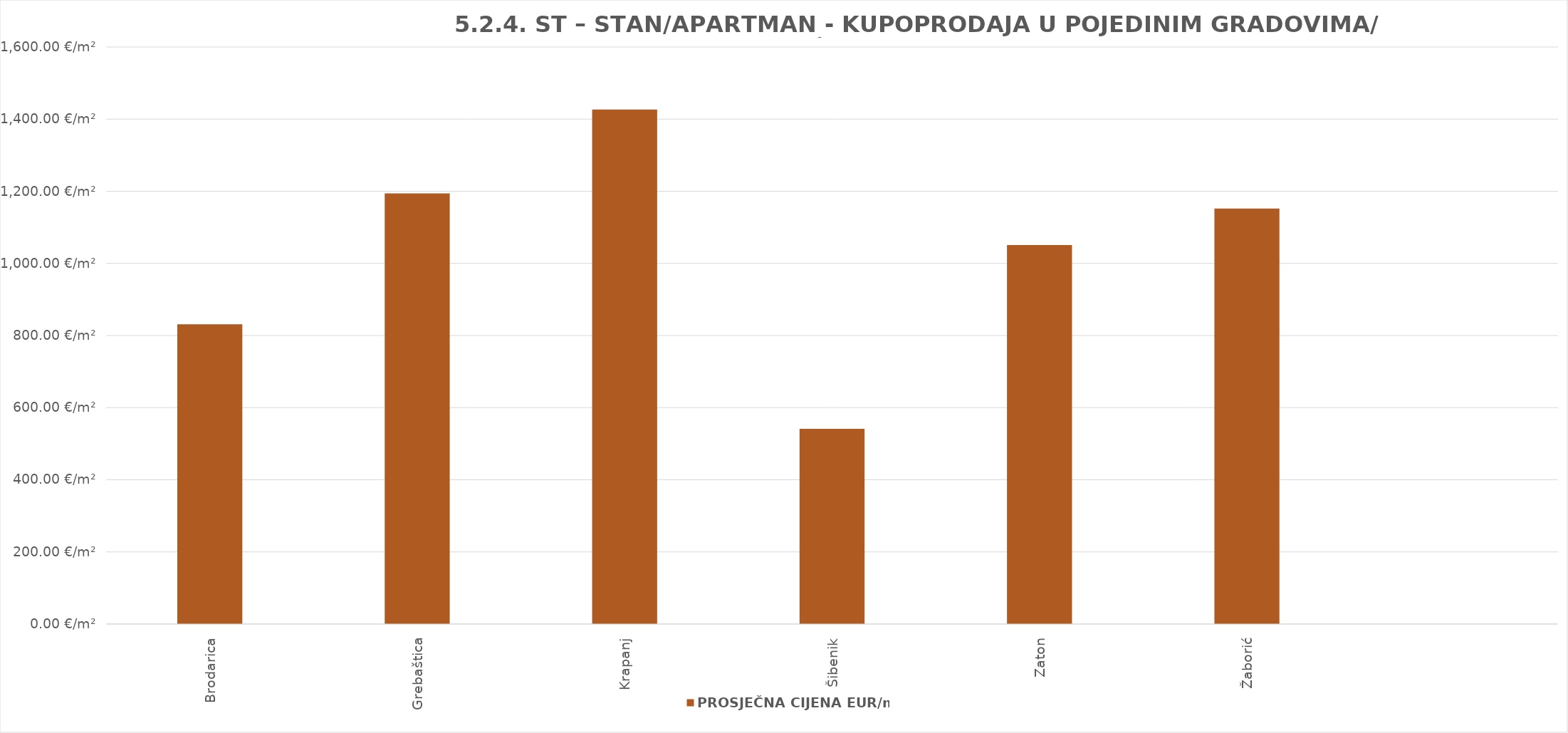
| Category | PROSJEČNA CIJENA EUR/m² |
|---|---|
| Brodarica | 1902-04-09 23:40:23 |
| Grebaštica | 1903-04-08 03:28:59 |
| Krapanj | 1903-11-26 14:41:30 |
| Šibenik | 1901-06-24 04:38:14 |
| Zaton | 1902-11-15 14:59:00 |
| Žaborić | 1903-02-24 20:53:44 |